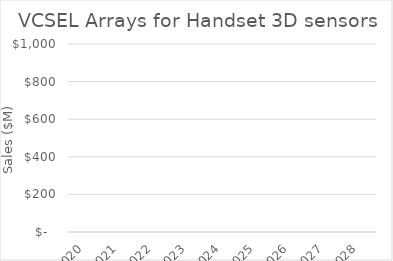
| Category | Series 0 |
|---|---|
| 2020.0 | 0 |
| 2021.0 | 0 |
| 2022.0 | 0 |
| 2023.0 | 0 |
| 2024.0 | 0 |
| 2025.0 | 0 |
| 2026.0 | 0 |
| 2027.0 | 0 |
| 2028.0 | 0 |